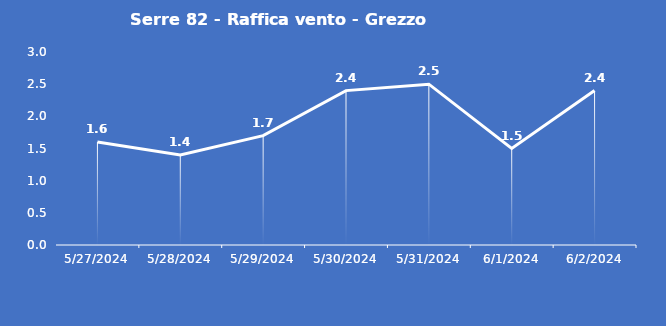
| Category | Serre 82 - Raffica vento - Grezzo (m/s) |
|---|---|
| 5/27/24 | 1.6 |
| 5/28/24 | 1.4 |
| 5/29/24 | 1.7 |
| 5/30/24 | 2.4 |
| 5/31/24 | 2.5 |
| 6/1/24 | 1.5 |
| 6/2/24 | 2.4 |